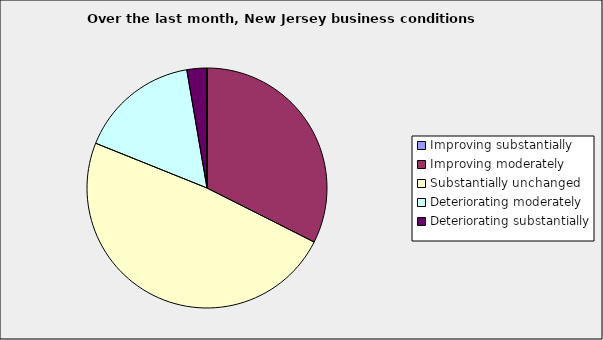
| Category | Series 0 |
|---|---|
| Improving substantially | 0 |
| Improving moderately | 0.324 |
| Substantially unchanged | 0.486 |
| Deteriorating moderately | 0.162 |
| Deteriorating substantially | 0.027 |